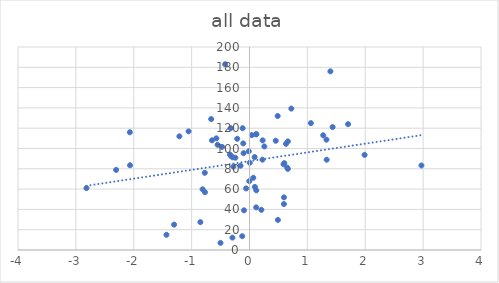
| Category | Series 0 |
|---|---|
| -0.057495 | 60.638 |
| -2.304472 | 78.914 |
| -0.154541 | 83.043 |
| 0.594941 | 45.295 |
| 0.204632 | 39.576 |
| -0.094986 | 39.096 |
| -0.212092 | 109.553 |
| -1.052822 | 116.88 |
| 0.08861 | 91.514 |
| -0.278246 | 82.118 |
| 0.004173 | 85.997 |
| 0.601421 | 85.593 |
| 1.436203 | 121.12 |
| 1.32947 | 108.728 |
| -0.004148 | 67.836 |
| 0.722918 | 139.298 |
| -0.810685 | 59.801 |
| 0.117816 | 58.764 |
| -0.101765 | 95.408 |
| -0.647895 | 108.079 |
| -0.551557 | 103.672 |
| -0.474157 | 101.606 |
| 0.651882 | 81.148 |
| -1.211541 | 112 |
| -0.336803 | 94.008 |
| -0.318532 | 92.584 |
| -0.772422 | 76.033 |
| -0.012498 | 97.237 |
| -0.324444 | 120 |
| 0.453295 | 107.6 |
| 0.040259 | 113.2 |
| 0.486838 | 132 |
| -1.302399 | 25 |
| 0.224012 | 89 |
| -2.064652 | 83.5 |
| -0.500908 | 7 |
| 1.988892 | 93.7 |
| 0.630602 | 104.6 |
| -0.421246 | 183 |
| 0.49116 | 29.6 |
| -0.294732 | 12.2 |
| 0.119883 | 114.1 |
| -2.817278 | 61 |
| 1.703197 | 124 |
| -0.108056 | 105 |
| 0.588321 | 84.4 |
| -1.434603 | 15 |
| 0.116059 | 42 |
| 0.595772 | 51.9 |
| 0.662588 | 107 |
| -0.572878 | 110 |
| 2.970948 | 83.28 |
| 1.060976 | 125 |
| -2.067601 | 116 |
| 0.110727 | 114 |
| -0.293477 | 91.33 |
| -0.661979 | 129 |
| -0.244798 | 90.91 |
| -0.84875 | 27.43 |
| 1.397693 | 176 |
| -0.769549 | 56.96 |
| 0.092632 | 62.14 |
| 0.256635 | 102 |
| -0.118373 | 120 |
| 0.226977 | 108 |
| 0.065349 | 71.13 |
| 0.66236 | 79.89 |
| 1.333541 | 88.95 |
| 1.273767 | 113 |
| -0.125599 | 13.62 |